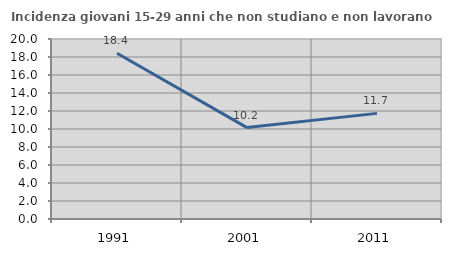
| Category | Incidenza giovani 15-29 anni che non studiano e non lavorano  |
|---|---|
| 1991.0 | 18.417 |
| 2001.0 | 10.156 |
| 2011.0 | 11.736 |